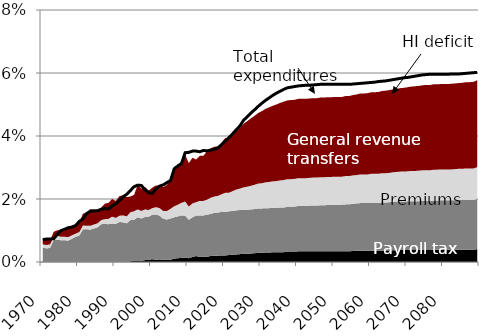
| Category | Total expenditures |
|---|---|
| 0 | 0.007 |
| 1 | 0.007 |
| 2 | 0.007 |
| 3 | 0.007 |
| 4 | 0.009 |
| 5 | 0.01 |
| 6 | 0.01 |
| 7 | 0.011 |
| 8 | 0.011 |
| 9 | 0.012 |
| 10 | 0.013 |
| 11 | 0.014 |
| 12 | 0.015 |
| 13 | 0.016 |
| 14 | 0.016 |
| 15 | 0.016 |
| 16 | 0.017 |
| 17 | 0.017 |
| 18 | 0.017 |
| 19 | 0.018 |
| 20 | 0.018 |
| 21 | 0.02 |
| 22 | 0.021 |
| 23 | 0.022 |
| 24 | 0.023 |
| 25 | 0.024 |
| 26 | 0.024 |
| 27 | 0.024 |
| 28 | 0.023 |
| 29 | 0.022 |
| 30 | 0.022 |
| 31 | 0.023 |
| 32 | 0.024 |
| 33 | 0.024 |
| 34 | 0.025 |
| 35 | 0.026 |
| 36 | 0.03 |
| 37 | 0.03 |
| 38 | 0.031 |
| 39 | 0.035 |
| 40 | 0.035 |
| 41 | 0.035 |
| 42 | 0.035 |
| 43 | 0.035 |
| 44 | 0.035 |
| 45 | 0.035 |
| 46 | 0.036 |
| 47 | 0.036 |
| 48 | 0.036 |
| 49 | 0.037 |
| 50 | 0.038 |
| 51 | 0.04 |
| 52 | 0.041 |
| 53 | 0.042 |
| 54 | 0.043 |
| 55 | 0.045 |
| 56 | 0.046 |
| 57 | 0.047 |
| 58 | 0.048 |
| 59 | 0.049 |
| 60 | 0.05 |
| 61 | 0.051 |
| 62 | 0.052 |
| 63 | 0.053 |
| 64 | 0.054 |
| 65 | 0.054 |
| 66 | 0.055 |
| 67 | 0.055 |
| 68 | 0.056 |
| 69 | 0.056 |
| 70 | 0.056 |
| 71 | 0.056 |
| 72 | 0.056 |
| 73 | 0.056 |
| 74 | 0.056 |
| 75 | 0.056 |
| 76 | 0.056 |
| 77 | 0.056 |
| 78 | 0.056 |
| 79 | 0.056 |
| 80 | 0.056 |
| 81 | 0.056 |
| 82 | 0.056 |
| 83 | 0.056 |
| 84 | 0.056 |
| 85 | 0.056 |
| 86 | 0.057 |
| 87 | 0.057 |
| 88 | 0.057 |
| 89 | 0.057 |
| 90 | 0.057 |
| 91 | 0.057 |
| 92 | 0.057 |
| 93 | 0.057 |
| 94 | 0.058 |
| 95 | 0.058 |
| 96 | 0.058 |
| 97 | 0.058 |
| 98 | 0.058 |
| 99 | 0.058 |
| 100 | 0.059 |
| 101 | 0.059 |
| 102 | 0.059 |
| 103 | 0.059 |
| 104 | 0.059 |
| 105 | 0.06 |
| 106 | 0.06 |
| 107 | 0.06 |
| 108 | 0.06 |
| 109 | 0.06 |
| 110 | 0.06 |
| 111 | 0.06 |
| 112 | 0.06 |
| 113 | 0.06 |
| 114 | 0.06 |
| 115 | 0.06 |
| 116 | 0.06 |
| 117 | 0.06 |
| 118 | 0.06 |
| 119 | 0.06 |